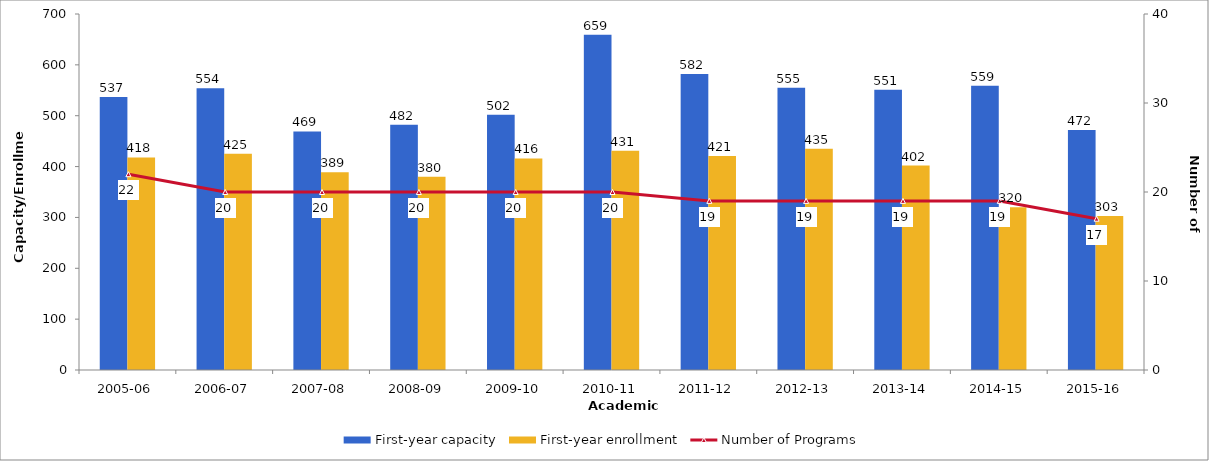
| Category | First-year capacity | First-year enrollment |
|---|---|---|
| 2005-06 | 537 | 418 |
| 2006-07 | 554 | 425 |
| 2007-08 | 469 | 389 |
| 2008-09 | 482 | 380 |
| 2009-10 | 502 | 416 |
| 2010-11 | 659 | 431 |
| 2011-12 | 582 | 421 |
| 2012-13 | 555 | 435 |
| 2013-14 | 551 | 402 |
| 2014-15 | 559 | 320 |
| 2015-16 | 472 | 303 |